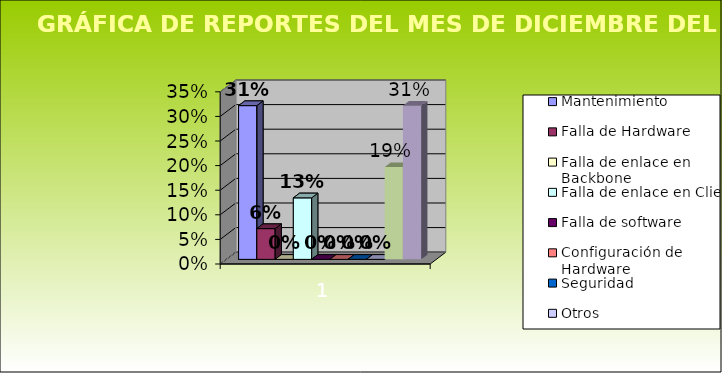
| Category | Mantenimiento | Falla de Hardware | Falla de enlace en Backbone | Falla de enlace en Cliente | Falla de software | Configuración de Hardware | Seguridad | Otros | Red Cudi | Red NIBA |
|---|---|---|---|---|---|---|---|---|---|---|
| 0 | 0.312 | 0.062 | 0 | 0.125 | 0 | 0 | 0 | 0 | 0.188 | 0.312 |